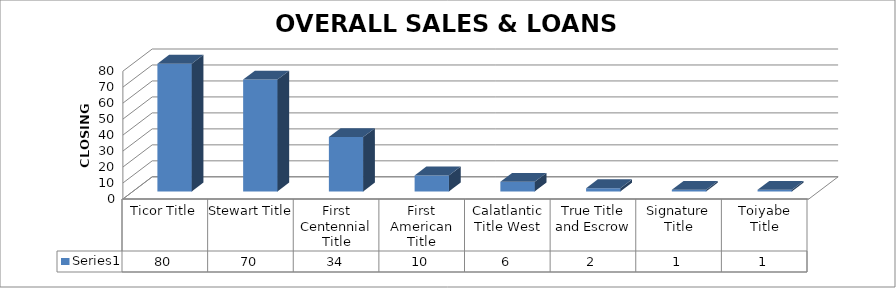
| Category | Series 0 |
|---|---|
| Ticor Title | 80 |
| Stewart Title | 70 |
| First Centennial Title | 34 |
| First American Title | 10 |
| Calatlantic Title West | 6 |
| True Title and Escrow | 2 |
| Signature Title | 1 |
| Toiyabe Title | 1 |